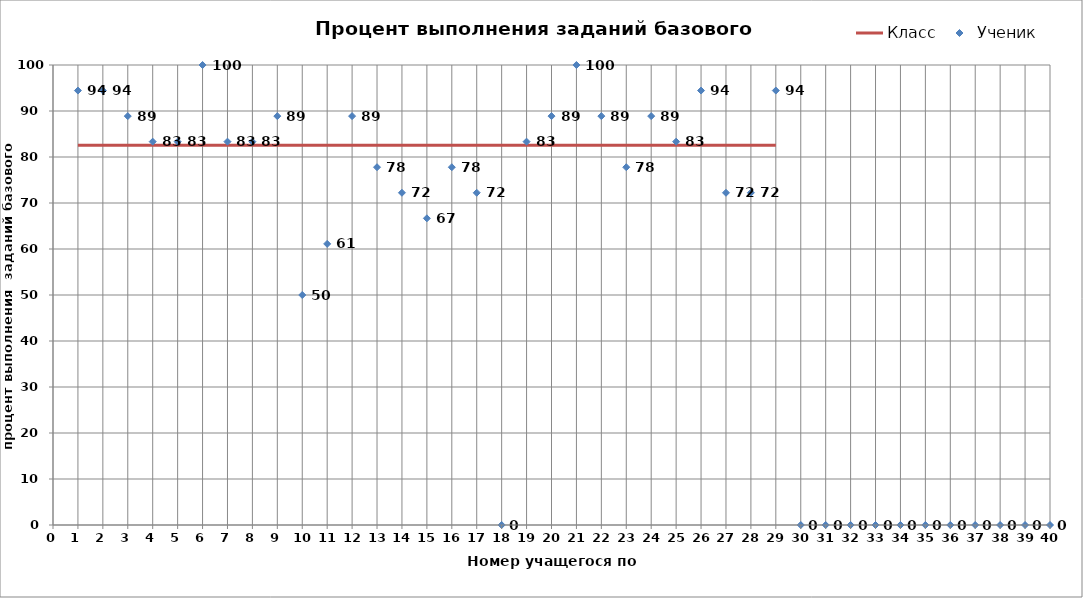
| Category | Класс |
|---|---|
| 0 | 82.54 |
| 1 | 82.54 |
| 2 | 82.54 |
| 3 | 82.54 |
| 4 | 82.54 |
| 5 | 82.54 |
| 6 | 82.54 |
| 7 | 82.54 |
| 8 | 82.54 |
| 9 | 82.54 |
| 10 | 82.54 |
| 11 | 82.54 |
| 12 | 82.54 |
| 13 | 82.54 |
| 14 | 82.54 |
| 15 | 82.54 |
| 16 | 82.54 |
| 17 | 82.54 |
| 18 | 82.54 |
| 19 | 82.54 |
| 20 | 82.54 |
| 21 | 82.54 |
| 22 | 82.54 |
| 23 | 82.54 |
| 24 | 82.54 |
| 25 | 82.54 |
| 26 | 82.54 |
| 27 | 82.54 |
| 28 | 82.54 |
| 29 | 82.54 |
| 30 | 82.54 |
| 31 | 82.54 |
| 32 | 82.54 |
| 33 | 82.54 |
| 34 | 82.54 |
| 35 | 82.54 |
| 36 | 82.54 |
| 37 | 82.54 |
| 38 | 82.54 |
| 39 | 82.54 |